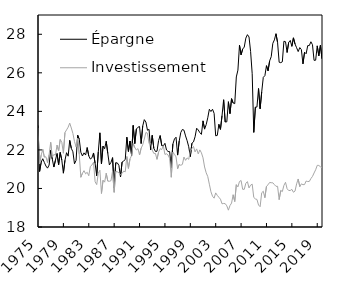
| Category | Épargne  | Investissement  |
|---|---|---|
| 1975-01-01 | 23.268 | 23.138 |
| 1975-04-01 | 20.879 | 21.279 |
| 1975-07-01 | 21.365 | 21.729 |
| 1975-10-01 | 21.542 | 22.031 |
| 1976-01-01 | 21.349 | 21.625 |
| 1976-04-01 | 21.163 | 21.644 |
| 1976-07-01 | 21.053 | 21.335 |
| 1976-10-01 | 21.212 | 21.752 |
| 1977-01-01 | 21.996 | 22.396 |
| 1977-04-01 | 21.528 | 21.624 |
| 1977-07-01 | 21.111 | 21.769 |
| 1977-10-01 | 21.465 | 21.726 |
| 1978-01-01 | 21.817 | 22.248 |
| 1978-04-01 | 21.233 | 21.944 |
| 1978-07-01 | 21.869 | 22.541 |
| 1978-10-01 | 21.471 | 22.394 |
| 1979-01-01 | 20.793 | 21.829 |
| 1979-04-01 | 21.463 | 22.902 |
| 1979-07-01 | 21.856 | 23.038 |
| 1979-10-01 | 21.675 | 23.18 |
| 1980-01-01 | 22.494 | 23.389 |
| 1980-04-01 | 22.08 | 23.135 |
| 1980-07-01 | 21.904 | 22.856 |
| 1980-10-01 | 21.278 | 22.434 |
| 1981-01-01 | 21.46 | 22.161 |
| 1981-04-01 | 22.765 | 22.606 |
| 1981-07-01 | 22.549 | 21.767 |
| 1981-10-01 | 21.878 | 20.581 |
| 1982-01-01 | 21.685 | 20.788 |
| 1982-04-01 | 21.848 | 20.922 |
| 1982-07-01 | 21.734 | 20.758 |
| 1982-10-01 | 22.121 | 20.839 |
| 1983-01-01 | 21.687 | 20.66 |
| 1983-04-01 | 21.526 | 21.145 |
| 1983-07-01 | 21.593 | 21.216 |
| 1983-10-01 | 21.841 | 21.361 |
| 1984-01-01 | 21.302 | 20.346 |
| 1984-04-01 | 20.657 | 20.201 |
| 1984-07-01 | 21.897 | 20.788 |
| 1984-10-01 | 22.887 | 20.944 |
| 1985-01-01 | 21.27 | 19.74 |
| 1985-04-01 | 22.2 | 20.423 |
| 1985-07-01 | 22.062 | 20.327 |
| 1985-10-01 | 22.449 | 20.787 |
| 1986-01-01 | 21.813 | 20.381 |
| 1986-04-01 | 21.221 | 20.372 |
| 1986-07-01 | 21.353 | 20.402 |
| 1986-10-01 | 21.599 | 20.901 |
| 1987-01-01 | 20.036 | 19.799 |
| 1987-04-01 | 21.334 | 20.884 |
| 1987-07-01 | 21.325 | 20.861 |
| 1987-10-01 | 21.197 | 20.813 |
| 1988-01-01 | 20.598 | 20.699 |
| 1988-04-01 | 21.367 | 20.777 |
| 1988-07-01 | 21.428 | 20.9 |
| 1988-10-01 | 21.5 | 20.865 |
| 1989-01-01 | 22.661 | 21.657 |
| 1989-04-01 | 21.919 | 21.041 |
| 1989-07-01 | 22.461 | 21.537 |
| 1989-10-01 | 21.712 | 21.707 |
| 1990-01-01 | 23.271 | 22.332 |
| 1990-04-01 | 22.329 | 22.119 |
| 1990-07-01 | 23.082 | 21.996 |
| 1990-10-01 | 23.177 | 22.066 |
| 1991-01-01 | 23.216 | 21.737 |
| 1991-04-01 | 22.33 | 22.088 |
| 1991-07-01 | 23.238 | 22.265 |
| 1991-10-01 | 23.57 | 22.564 |
| 1992-01-01 | 23.446 | 22.904 |
| 1992-04-01 | 23.022 | 22.869 |
| 1992-07-01 | 23.064 | 22.328 |
| 1992-10-01 | 21.998 | 22.352 |
| 1993-01-01 | 22.756 | 21.988 |
| 1993-04-01 | 22.082 | 21.817 |
| 1993-07-01 | 21.921 | 21.82 |
| 1993-10-01 | 21.929 | 21.511 |
| 1994-01-01 | 22.486 | 21.886 |
| 1994-04-01 | 22.745 | 22.065 |
| 1994-07-01 | 22.222 | 22.019 |
| 1994-10-01 | 22.205 | 22.215 |
| 1995-01-01 | 22.342 | 21.765 |
| 1995-04-01 | 21.995 | 21.799 |
| 1995-07-01 | 21.918 | 21.733 |
| 1995-10-01 | 21.91 | 21.556 |
| 1996-01-01 | 21.072 | 20.581 |
| 1996-04-01 | 22.301 | 21.878 |
| 1996-07-01 | 22.564 | 21.774 |
| 1996-10-01 | 22.659 | 21.636 |
| 1997-01-01 | 21.73 | 21.024 |
| 1997-04-01 | 22.46 | 21.249 |
| 1997-07-01 | 22.905 | 21.202 |
| 1997-10-01 | 23.061 | 21.246 |
| 1998-01-01 | 23.024 | 21.63 |
| 1998-04-01 | 22.726 | 21.459 |
| 1998-07-01 | 22.476 | 21.584 |
| 1998-10-01 | 22.163 | 21.513 |
| 1999-01-01 | 21.652 | 21.933 |
| 1999-04-01 | 22.343 | 22.074 |
| 1999-07-01 | 22.415 | 22.177 |
| 1999-10-01 | 22.681 | 21.896 |
| 2000-01-01 | 23.124 | 22.052 |
| 2000-04-01 | 23.034 | 21.794 |
| 2000-07-01 | 22.896 | 22.001 |
| 2000-10-01 | 22.806 | 21.85 |
| 2001-01-01 | 23.507 | 21.59 |
| 2001-04-01 | 23.078 | 21.113 |
| 2001-07-01 | 23.312 | 20.814 |
| 2001-10-01 | 23.666 | 20.617 |
| 2002-01-01 | 24.108 | 20.221 |
| 2002-04-01 | 23.991 | 19.827 |
| 2002-07-01 | 24.11 | 19.596 |
| 2002-10-01 | 23.896 | 19.497 |
| 2003-01-01 | 22.731 | 19.769 |
| 2003-04-01 | 22.753 | 19.64 |
| 2003-07-01 | 23.328 | 19.542 |
| 2003-10-01 | 23.066 | 19.442 |
| 2004-01-01 | 23.779 | 19.204 |
| 2004-04-01 | 24.603 | 19.222 |
| 2004-07-01 | 23.446 | 19.211 |
| 2004-10-01 | 23.457 | 19.098 |
| 2005-01-01 | 24.501 | 18.873 |
| 2005-04-01 | 23.884 | 19.112 |
| 2005-07-01 | 24.659 | 19.241 |
| 2005-10-01 | 24.432 | 19.672 |
| 2006-01-01 | 24.399 | 19.323 |
| 2006-04-01 | 25.785 | 20.197 |
| 2006-07-01 | 26.14 | 20.082 |
| 2006-10-01 | 27.432 | 20.363 |
| 2007-01-01 | 26.934 | 20.411 |
| 2007-04-01 | 27.233 | 19.955 |
| 2007-07-01 | 27.336 | 19.955 |
| 2007-10-01 | 27.801 | 20.268 |
| 2008-01-01 | 27.98 | 20.355 |
| 2008-04-01 | 27.86 | 20.027 |
| 2008-07-01 | 27.103 | 20.173 |
| 2008-10-01 | 25.952 | 20.222 |
| 2009-01-01 | 22.909 | 19.534 |
| 2009-04-01 | 24.222 | 19.457 |
| 2009-07-01 | 24.223 | 19.431 |
| 2009-10-01 | 25.186 | 19.14 |
| 2010-01-01 | 24.134 | 19.054 |
| 2010-04-01 | 25.008 | 19.777 |
| 2010-07-01 | 25.767 | 19.854 |
| 2010-10-01 | 25.852 | 19.52 |
| 2011-01-01 | 26.371 | 20.114 |
| 2011-04-01 | 26.106 | 20.192 |
| 2011-07-01 | 26.62 | 20.312 |
| 2011-10-01 | 26.837 | 20.298 |
| 2012-01-01 | 27.528 | 20.292 |
| 2012-04-01 | 27.709 | 20.2 |
| 2012-07-01 | 28.029 | 20.109 |
| 2012-10-01 | 27.574 | 20.112 |
| 2013-01-01 | 26.548 | 19.42 |
| 2013-04-01 | 26.527 | 19.894 |
| 2013-07-01 | 26.572 | 19.837 |
| 2013-10-01 | 27.639 | 20.159 |
| 2014-01-01 | 27.615 | 20.319 |
| 2014-04-01 | 27.057 | 19.987 |
| 2014-07-01 | 27.578 | 19.893 |
| 2014-10-01 | 27.68 | 19.894 |
| 2015-01-01 | 27.374 | 19.953 |
| 2015-04-01 | 27.815 | 19.803 |
| 2015-07-01 | 27.495 | 19.865 |
| 2015-10-01 | 27.302 | 20.24 |
| 2016-01-01 | 27.102 | 20.491 |
| 2016-04-01 | 27.31 | 20.092 |
| 2016-07-01 | 27.206 | 20.238 |
| 2016-10-01 | 26.465 | 20.196 |
| 2017-01-01 | 27.07 | 20.202 |
| 2017-04-01 | 26.988 | 20.385 |
| 2017-07-01 | 27.411 | 20.359 |
| 2017-10-01 | 27.414 | 20.364 |
| 2018-01-01 | 27.612 | 20.512 |
| 2018-04-01 | 27.457 | 20.624 |
| 2018-07-01 | 26.648 | 20.803 |
| 2018-10-01 | 26.654 | 20.97 |
| 2019-01-01 | 27.399 | 21.199 |
| 2019-04-01 | 26.883 | 21.192 |
| 2019-07-01 | 27.427 | 21.127 |
| 2019-10-01 | 26.73 | 21.083 |